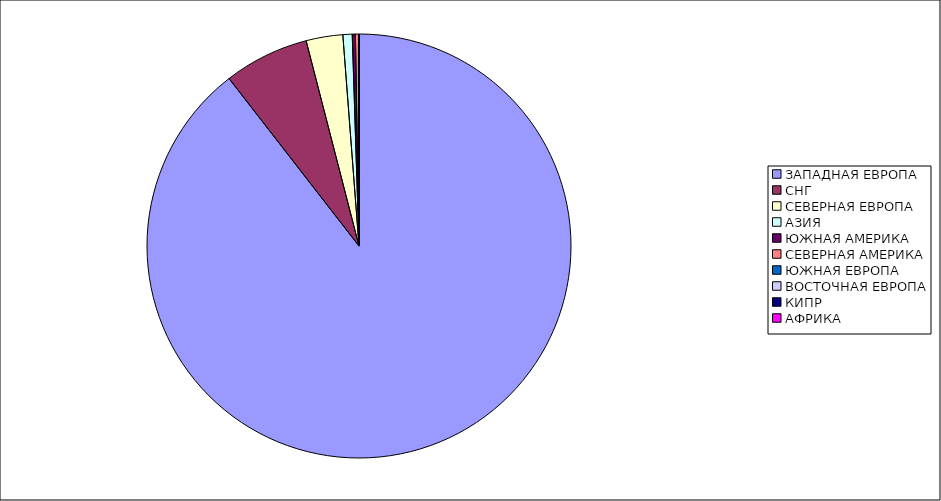
| Category | Оборот |
|---|---|
| ЗАПАДНАЯ ЕВРОПА | 0.895 |
| СНГ | 0.065 |
| СЕВЕРНАЯ ЕВРОПА | 0.028 |
| АЗИЯ | 0.007 |
| ЮЖНАЯ АМЕРИКА | 0.002 |
| СЕВЕРНАЯ АМЕРИКА | 0.002 |
| ЮЖНАЯ ЕВРОПА | 0 |
| ВОСТОЧНАЯ ЕВРОПА | 0 |
| КИПР | 0 |
| АФРИКА | 0 |